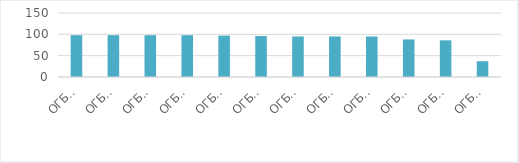
| Category | Series 0 |
|---|---|
| ОГБОУ СПО Ульяновский техникум железнодорожного транспорта | 98 |
| ОГБОУ СПО Ульяновский социально-педагогический колледж №1 | 98 |
| ОГБОУ СПО "Ульяновский строительный колледж" | 98 |
| ОГБОУ СПО «Ульяновский электромеханический колледж» | 98 |
| ОГБОУ СПО технологический техникум в р.п.Радищево | 97 |
| ОГБОУ СПОтехнологический техникум в р.п. Николаевка  | 96 |
| ОГБОУ СПО «Димитровградский техникум строительной индустрии» | 95 |
| ОГБОУ СПО «Димитровградский техникум профессиональных технологий имени Героя Советского Союза М.С.Чернова» | 95 |
| ОГБОУ СПО " Сурский агротехнологический техникум "  | 95 |
| ОГБОУ СПО технологический техникум р.п.Павловка | 88 |
| ОГБОУ СПО «Карсунский медицинский техникум» | 86 |
| ОГБОУ СПО «Димитровградский механико-технологический колледж молочной промышленности» | 37 |